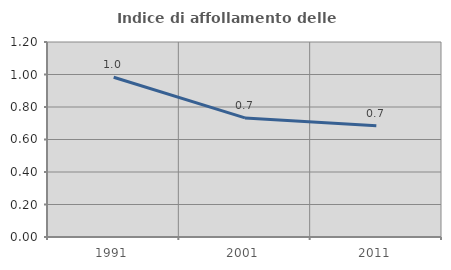
| Category | Indice di affollamento delle abitazioni  |
|---|---|
| 1991.0 | 0.983 |
| 2001.0 | 0.733 |
| 2011.0 | 0.685 |